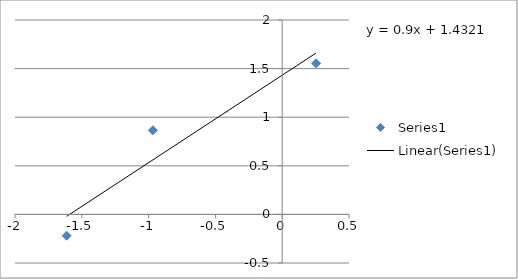
| Category | Series 0 |
|---|---|
| -1.6133583946523027 | -0.219 |
| -0.9674215661017007 | 0.866 |
| 0.2533471031357998 | 1.555 |